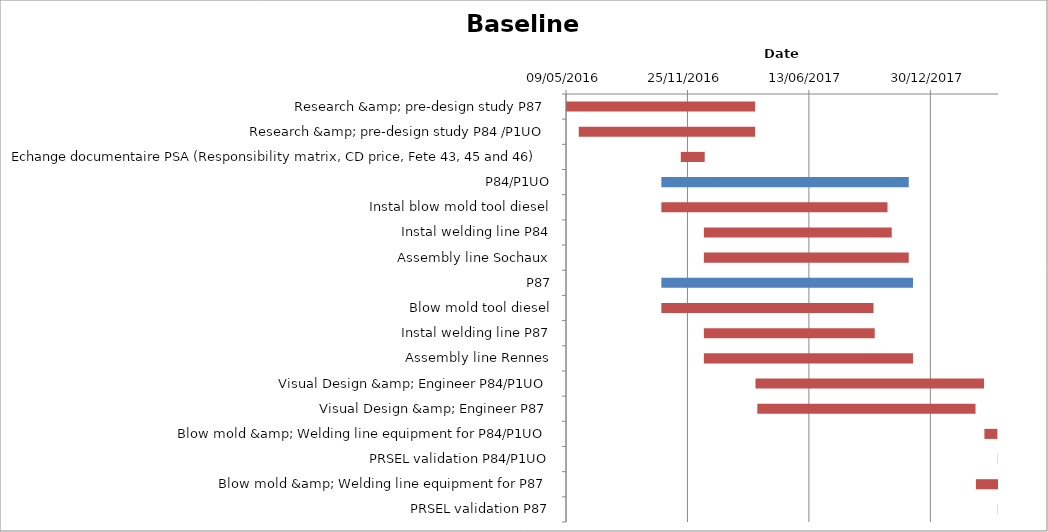
| Category | Baseline start | Actual duration |
|---|---|---|
| Research &amp; pre-design study P87 | 09/05/2016 | 311.375 |
| Research &amp; pre-design study P84 /P1UO | 30/05/2016 | 290.375 |
| Echange documentaire PSA (Responsibility matrix, CD price, Fete 43, 45 and 46) | 14/11/2016 | 39.375 |
| P84/P1UO | 13/10/2016 | 407.375 |
| Instal blow mold tool diesel | 13/10/2016 | 372.375 |
| Instal welding line P84 | 22/12/2016 | 309.375 |
| Assembly line Sochaux | 22/12/2016 | 337.375 |
| P87 | 13/10/2016 | 414.375 |
| Blow mold tool diesel | 13/10/2016 | 349.375 |
| Instal welding line P87 | 22/12/2016 | 281.375 |
| Assembly line Rennes | 22/12/2016 | 344.375 |
| Visual Design &amp; Engineer P84/P1UO | 17/03/2017 | 376.375 |
| Visual Design &amp; Engineer P87 | 20/03/2017 | 359.375 |
| Blow mold &amp; Welding line equipment for P84/P1UO | 29/03/2018 | 21.375 |
| PRSEL validation P84/P1UO | 19/04/2018 | 0.375 |
| Blow mold &amp; Welding line equipment for P87 | 15/03/2018 | 36.375 |
| PRSEL validation P87 | 20/04/2018 | 0.375 |